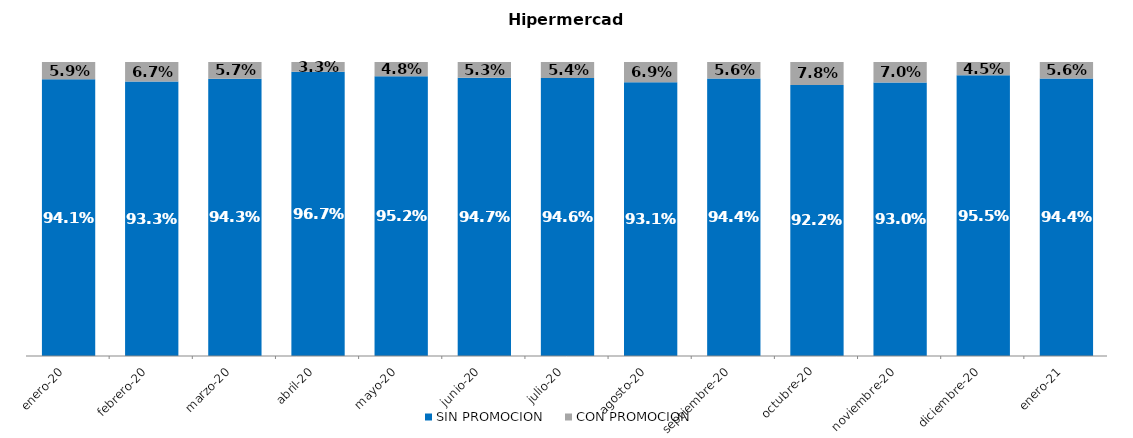
| Category | SIN PROMOCION   | CON PROMOCION   |
|---|---|---|
| 2020-01-01 | 0.941 | 0.059 |
| 2020-02-01 | 0.933 | 0.067 |
| 2020-03-01 | 0.943 | 0.057 |
| 2020-04-01 | 0.967 | 0.033 |
| 2020-05-01 | 0.952 | 0.048 |
| 2020-06-01 | 0.947 | 0.053 |
| 2020-07-01 | 0.946 | 0.054 |
| 2020-08-01 | 0.931 | 0.069 |
| 2020-09-01 | 0.944 | 0.056 |
| 2020-10-01 | 0.922 | 0.078 |
| 2020-11-01 | 0.93 | 0.07 |
| 2020-12-01 | 0.955 | 0.045 |
| 2021-01-01 | 0.944 | 0.056 |